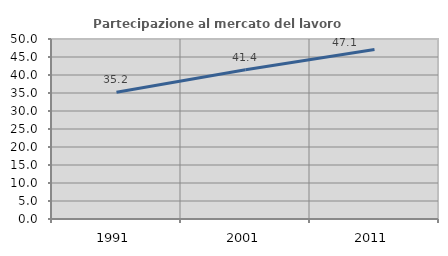
| Category | Partecipazione al mercato del lavoro  femminile |
|---|---|
| 1991.0 | 35.184 |
| 2001.0 | 41.449 |
| 2011.0 | 47.107 |